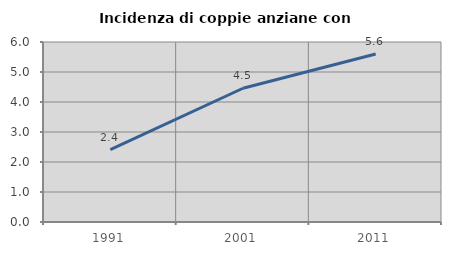
| Category | Incidenza di coppie anziane con figli |
|---|---|
| 1991.0 | 2.41 |
| 2001.0 | 4.459 |
| 2011.0 | 5.6 |